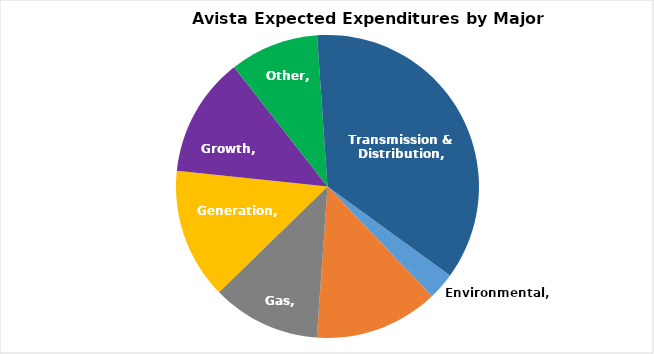
| Category | Business Unit |
|---|---|
| Environmental | 0.029 |
| Enterprise Technology | 0.132 |
| Gas | 0.116 |
| Generation | 0.139 |
| Growth | 0.128 |
| Other | 0.095 |
| Transmission & Distribution | 0.361 |